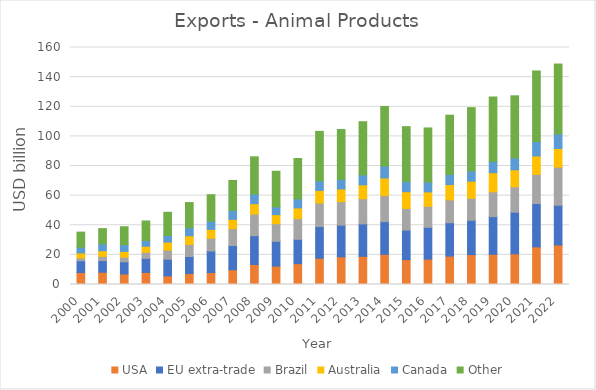
| Category | USA | EU extra-trade | Brazil | Australia | Canada | Other  |
|---|---|---|---|---|---|---|
| 2000.0 | 8113.357 | 7905.349 | 1910.798 | 3372.917 | 3801.522 | 10260.442 |
| 2001.0 | 8268.25 | 7860.785 | 2873.27 | 3823.613 | 4602.479 | 10316.582 |
| 2002.0 | 7116.147 | 8217.909 | 3125.465 | 3873.492 | 4575.039 | 12077.25 |
| 2003.0 | 8159.574 | 9452.454 | 4099.414 | 4090.591 | 3832.145 | 13261.1 |
| 2004.0 | 5794.908 | 11297.433 | 6149.712 | 5423.216 | 4408.717 | 15669.265 |
| 2005.0 | 7393.869 | 11524.31 | 8107.623 | 5855.886 | 5403.19 | 17032.739 |
| 2006.0 | 8065.982 | 14561.779 | 8576.36 | 6005.259 | 5456.128 | 17938.774 |
| 2007.0 | 9950.489 | 16366.781 | 11347.396 | 6341.117 | 6013.537 | 20246.809 |
| 2008.0 | 13497.055 | 19444.509 | 14598.733 | 7001.886 | 6472.701 | 25187.053 |
| 2009.0 | 12396.337 | 16721.619 | 11924.282 | 6114.523 | 5202.158 | 24093.016 |
| 2010.0 | 14062.363 | 16441.188 | 13971.146 | 7223.478 | 6102.597 | 27250.272 |
| 2011.0 | 17728.026 | 21446.737 | 15843.252 | 8471.286 | 6432.059 | 33472.949 |
| 2012.0 | 18748.477 | 21323.138 | 15878.57 | 8547.4 | 6484.11 | 33657.909 |
| 2013.0 | 19003.107 | 21891.829 | 17036.977 | 9375.037 | 6684.626 | 35900.722 |
| 2014.0 | 20382.573 | 22065.258 | 17571.947 | 11916.619 | 8019.878 | 40200.559 |
| 2015.0 | 16815.116 | 19893.405 | 14625.091 | 11315.699 | 6837.906 | 37068.272 |
| 2016.0 | 17133.601 | 21477.283 | 14204.988 | 9679.523 | 6666.26 | 36535.058 |
| 2017.0 | 19182.687 | 22518.867 | 15455.01 | 10315.931 | 6821.694 | 40006.469 |
| 2018.0 | 20161.55 | 23175.671 | 14883.15 | 11521.121 | 6857.8 | 42795.293 |
| 2019.0 | 20397.769 | 25416.468 | 16758.474 | 12936.361 | 7554.609 | 43515.259 |
| 2020.0 | 20705.466 | 28121.031 | 17133.928 | 11488.715 | 8044.654 | 41911.961 |
| 2021.0 | 25408.159 | 29273.815 | 19685.12 | 12434.324 | 9729.185 | 47629.069 |
| 2022.0 | 26689.081 | 26823.913 | 25693.176 | 12611.071 | 9815.279 | 47213.298 |